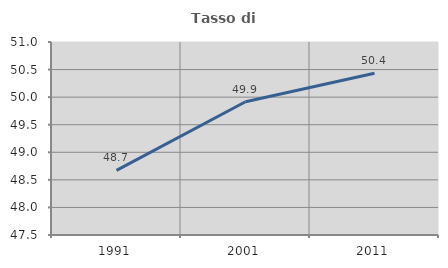
| Category | Tasso di occupazione   |
|---|---|
| 1991.0 | 48.671 |
| 2001.0 | 49.917 |
| 2011.0 | 50.432 |